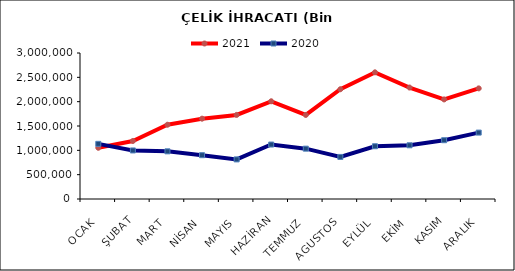
| Category | 2021 | 2020 |
|---|---|---|
| OCAK | 1052771.982 | 1133295.154 |
| ŞUBAT | 1191759.81 | 997635.546 |
| MART | 1526163.907 | 979413.159 |
| NİSAN | 1650534.852 | 900232.366 |
| MAYIS | 1727670.086 | 813839.487 |
| HAZİRAN | 2007816.501 | 1119137.226 |
| TEMMUZ | 1727219.998 | 1034390.329 |
| AGUSTOS | 2255380.09 | 864588.157 |
| EYLÜL | 2602635.837 | 1084073.135 |
| EKİM | 2290309.493 | 1103693.703 |
| KASIM | 2046035.58 | 1208069.787 |
| ARALIK | 2273114.584 | 1364472.056 |